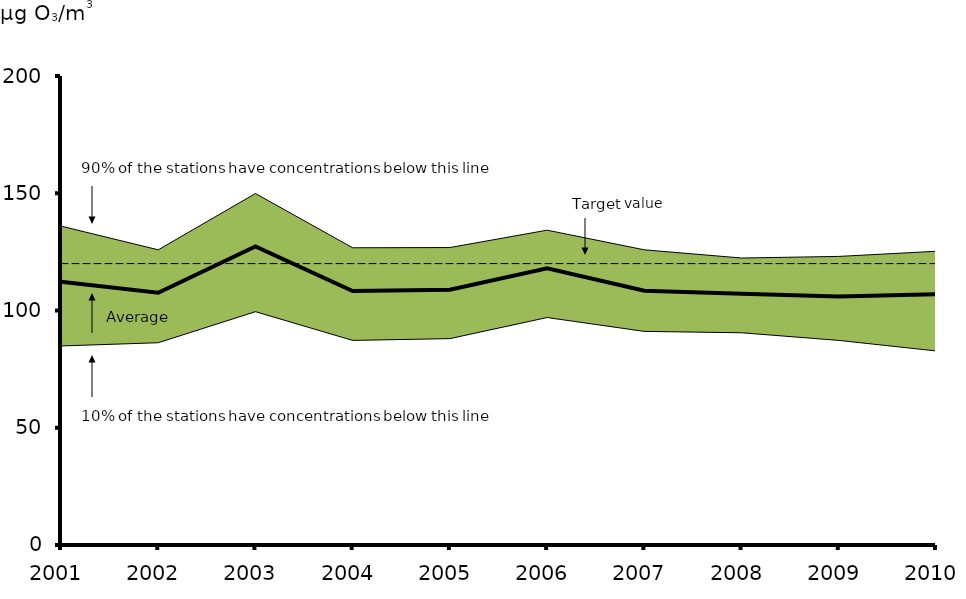
| Category | Average | Target value |
|---|---|---|
| 2001.0 | 112.292 | 120 |
| 2002.0 | 107.574 | 120 |
| 2003.0 | 127.307 | 120 |
| 2004.0 | 108.324 | 120 |
| 2005.0 | 108.843 | 120 |
| 2006.0 | 117.971 | 120 |
| 2007.0 | 108.419 | 120 |
| 2008.0 | 107.134 | 120 |
| 2009.0 | 105.92 | 120 |
| 2010.0 | 106.887 | 120 |